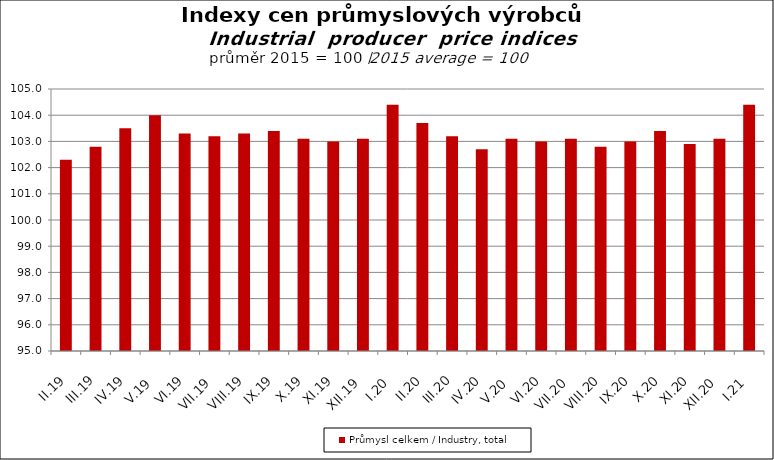
| Category | Průmysl celkem / Industry, total |
|---|---|
| II.19 | 102.3 |
| III.19 | 102.8 |
| IV.19 | 103.5 |
| V.19 | 104 |
| VI.19 | 103.3 |
| VII.19 | 103.2 |
| VIII.19 | 103.3 |
| IX.19 | 103.4 |
| X.19 | 103.1 |
| XI.19 | 103 |
| XII.19 | 103.1 |
| I.20 | 104.4 |
| II.20 | 103.7 |
| III.20 | 103.2 |
| IV.20 | 102.7 |
| V.20 | 103.1 |
| VI.20 | 103 |
| VII.20 | 103.1 |
| VIII.20 | 102.8 |
| IX.20 | 103 |
| X.20 | 103.4 |
| XI.20 | 102.9 |
| XII.20 | 103.1 |
| I.21 | 104.4 |